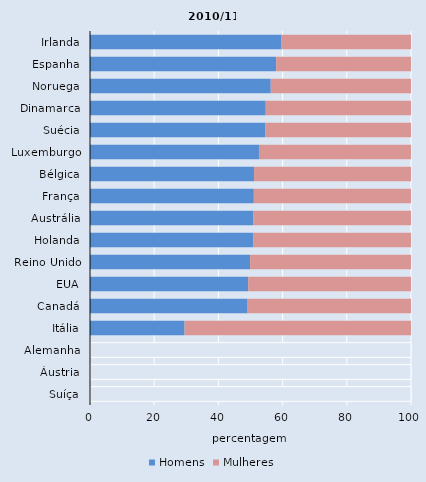
| Category | Homens | Mulheres |
|---|---|---|
| Irlanda | 59.67 | 40.33 |
| Espanha | 58.012 | 41.988 |
| Noruega | 56.306 | 43.694 |
| Dinamarca | 54.745 | 45.255 |
| Suécia | 54.577 | 45.423 |
| Luxemburgo | 52.636 | 47.364 |
| Bélgica | 51.115 | 48.885 |
| França | 51.042 | 48.958 |
| Austrália | 50.911 | 49.089 |
| Holanda | 50.835 | 49.165 |
| Reino Unido | 49.883 | 50.117 |
| EUA | 49.275 | 50.725 |
| Canadá | 49.101 | 50.899 |
| Itália | 29.452 | 70.548 |
| Alemanha | 100 | 0 |
| Áustria | 100 | 0 |
| Suíça | 100 | 0 |